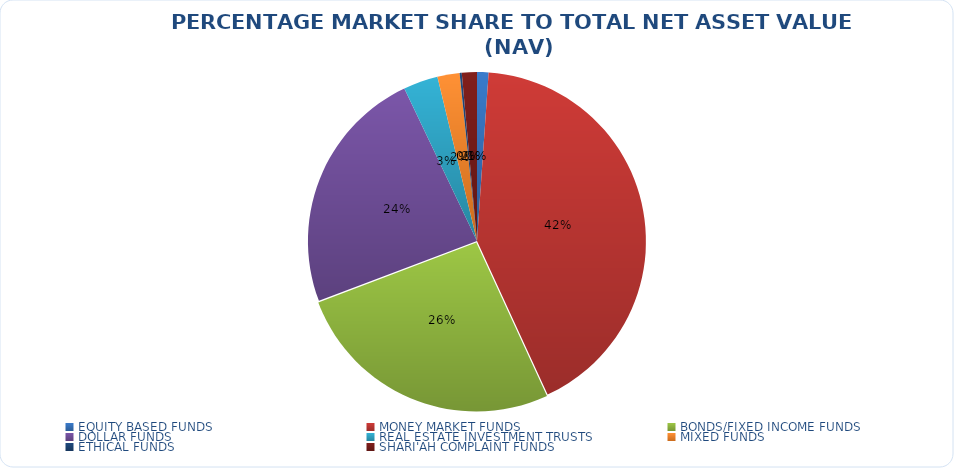
| Category | NET ASSET VALUE |
|---|---|
| EQUITY BASED FUNDS | 15091571938.02 |
| MONEY MARKET FUNDS | 577843844867.681 |
| BONDS/FIXED INCOME FUNDS | 358756134715.604 |
| DOLLAR FUNDS | 325559432299.453 |
| REAL ESTATE INVESTMENT TRUSTS | 45471708137.05 |
| MIXED FUNDS | 29123241376.558 |
| ETHICAL FUNDS | 2807498589.54 |
| SHARI'AH COMPLAINT FUNDS | 19804591061.69 |